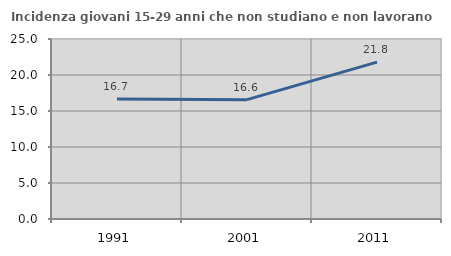
| Category | Incidenza giovani 15-29 anni che non studiano e non lavorano  |
|---|---|
| 1991.0 | 16.68 |
| 2001.0 | 16.575 |
| 2011.0 | 21.795 |